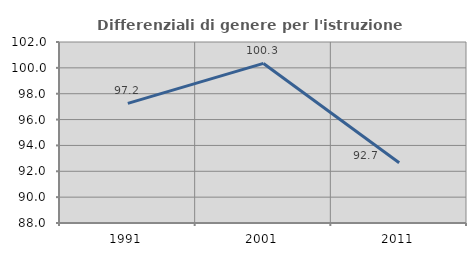
| Category | Differenziali di genere per l'istruzione superiore |
|---|---|
| 1991.0 | 97.25 |
| 2001.0 | 100.343 |
| 2011.0 | 92.664 |